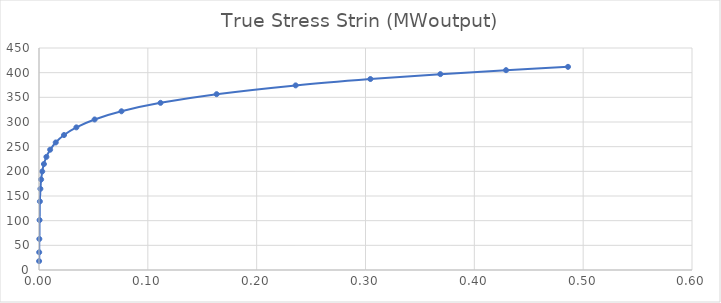
| Category | Series 0 |
|---|---|
| 8.99959502429071e-05 | 17.998 |
| 0.000179983801943807 | 35.995 |
| 0.000314950397916229 | 62.926 |
| 0.000517366143053604 | 101.21 |
| 0.000820912958736214 | 138.993 |
| 0.00127606548202025 | 164.522 |
| 0.00195839109970242 | 183.521 |
| 0.00298102233448872 | 199.757 |
| 0.00451300107383731 | 214.783 |
| 0.00680658256963524 | 229.33 |
| 0.0102371214079935 | 243.824 |
| 0.0153610132102306 | 258.516 |
| 0.0229978113721286 | 273.57 |
| 0.0343449033807882 | 289.113 |
| 0.0511277156801529 | 305.149 |
| 0.0757852575808854 | 321.736 |
| 0.111667484848671 | 338.843 |
| 0.163187156184584 | 356.386 |
| 0.235807819867008 | 374.221 |
| 0.304488303267768 | 387.102 |
| 0.368753404755717 | 397.03 |
| 0.429136711841463 | 405.068 |
| 0.486080574800857 | 411.79 |